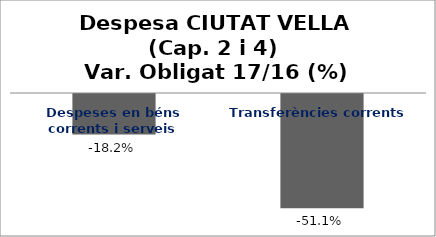
| Category | Series 0 |
|---|---|
| Despeses en béns corrents i serveis | -0.182 |
| Transferències corrents | -0.511 |